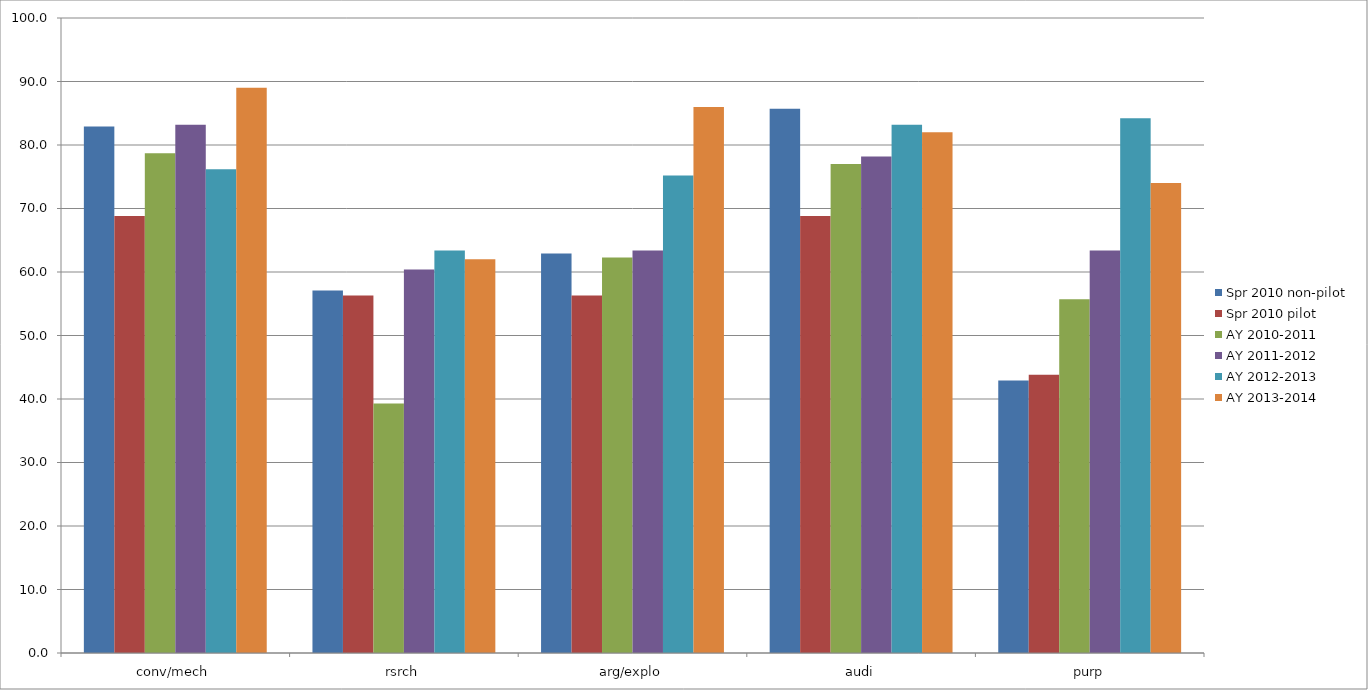
| Category | Spr 2010 non-pilot | Spr 2010 pilot | AY 2010-2011 | AY 2011-2012 | AY 2012-2013 | AY 2013-2014 |
|---|---|---|---|---|---|---|
| conv/mech | 82.9 | 68.8 | 78.7 | 83.2 | 76.2 | 89 |
| rsrch | 57.1 | 56.3 | 39.3 | 60.4 | 63.4 | 62 |
| arg/explo | 62.9 | 56.3 | 62.3 | 63.4 | 75.2 | 86 |
| audi | 85.7 | 68.8 | 77 | 78.2 | 83.2 | 82 |
| purp | 42.9 | 43.8 | 55.7 | 63.4 | 84.2 | 74 |